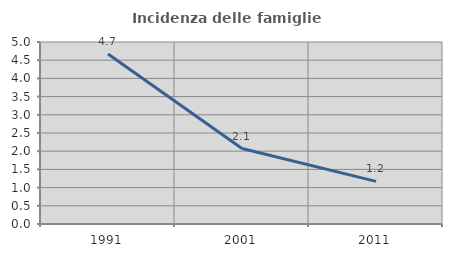
| Category | Incidenza delle famiglie numerose |
|---|---|
| 1991.0 | 4.672 |
| 2001.0 | 2.073 |
| 2011.0 | 1.172 |